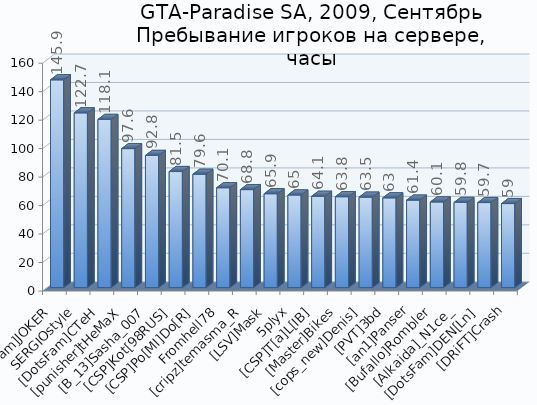
| Category | Series 0 |
|---|---|
| [DotsFam]JOKER | 145.9 |
| SERGIOstyle | 122.7 |
| [DotsFam]CTeH | 118.1 |
| [punisher]tHeMaX | 97.6 |
| [B_13]Sasha_007 | 92.8 |
| [CSP]Kot[98RUS] | 81.5 |
| [CSP]Po[MI]Do[R] | 79.6 |
| Fromhell78 | 70.1 |
| [cripz]temasma_R | 68.8 |
| [LSV]Mask | 65.9 |
| 5plyx | 65 |
| [CSP]T[a]L[IB] | 64.1 |
| [Master]Bikes | 63.8 |
| [cops_new]Denis] | 63.5 |
| [PVT]3bd | 63 |
| [an1]Panser | 61.4 |
| [Bufallo]Rombler | 60.1 |
| [Alkaida]_N1ce_ | 59.8 |
| [DotsFam]DEN[Ln] | 59.7 |
| [DRiFT]Crash | 59 |